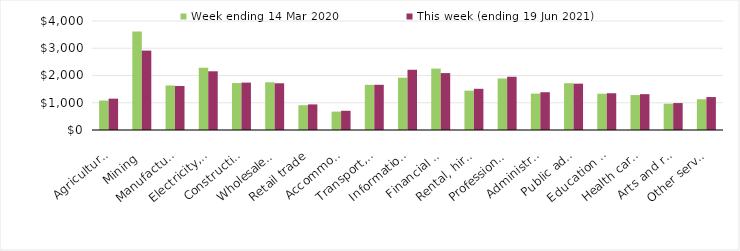
| Category | Week ending 14 Mar 2020 | This week (ending 19 Jun 2021) |
|---|---|---|
| Agriculture, forestry and fishing | 1081.53 | 1150.03 |
| Mining | 3610.69 | 2914.11 |
| Manufacturing | 1634.66 | 1613.85 |
| Electricity, gas, water and waste services | 2285.17 | 2154.33 |
| Construction | 1723.57 | 1739.52 |
| Wholesale trade | 1750.69 | 1714.59 |
| Retail trade | 908.64 | 939.26 |
| Accommodation and food services | 675.67 | 705.05 |
| Transport, postal and warehousing | 1657.14 | 1659.41 |
| Information media and telecommunications | 1918.42 | 2210.13 |
| Financial and insurance services | 2253.56 | 2088.67 |
| Rental, hiring and real estate services | 1444.11 | 1511.52 |
| Professional, scientific and technical services | 1888.69 | 1953.9 |
| Administrative and support services | 1335.4 | 1386.06 |
| Public administration and safety | 1717.61 | 1700.53 |
| Education and training | 1330.81 | 1348.74 |
| Health care and social assistance | 1281.91 | 1315.44 |
| Arts and recreation services | 964.34 | 988.46 |
| Other services | 1128.89 | 1208.97 |